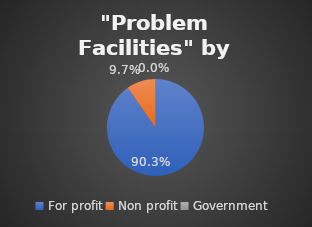
| Category | Series 0 |
|---|---|
| For profit | 0.903 |
| Non profit | 0.097 |
| Government | 0 |